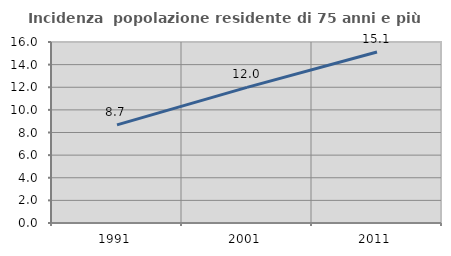
| Category | Incidenza  popolazione residente di 75 anni e più |
|---|---|
| 1991.0 | 8.674 |
| 2001.0 | 11.99 |
| 2011.0 | 15.121 |